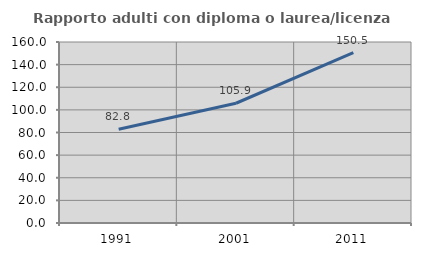
| Category | Rapporto adulti con diploma o laurea/licenza media  |
|---|---|
| 1991.0 | 82.822 |
| 2001.0 | 105.858 |
| 2011.0 | 150.534 |